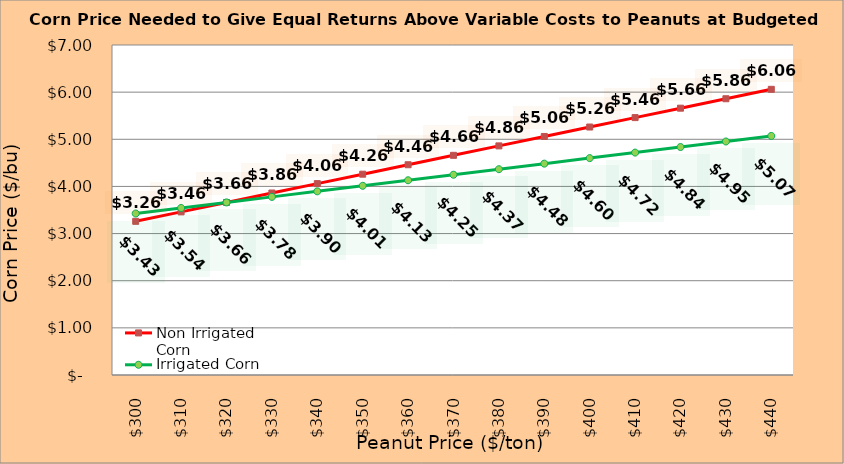
| Category | Non Irrigated Corn | Irrigated Corn |
|---|---|---|
| 299.8936170212766 | 3.26 | 3.426 |
| 309.8936170212766 | 3.46 | 3.543 |
| 319.8936170212766 | 3.66 | 3.661 |
| 329.8936170212766 | 3.86 | 3.778 |
| 339.8936170212766 | 4.06 | 3.896 |
| 349.8936170212766 | 4.26 | 4.013 |
| 359.8936170212766 | 4.46 | 4.131 |
| 369.8936170212766 | 4.66 | 4.248 |
| 379.8936170212766 | 4.86 | 4.366 |
| 389.8936170212766 | 5.06 | 4.483 |
| 399.8936170212766 | 5.26 | 4.601 |
| 409.8936170212766 | 5.46 | 4.718 |
| 419.8936170212766 | 5.66 | 4.836 |
| 429.8936170212766 | 5.86 | 4.953 |
| 439.8936170212766 | 6.06 | 5.071 |